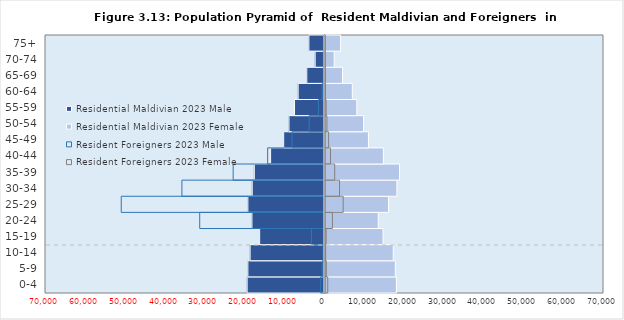
| Category | Residential Maldivian 2023 | Resident Foreigners 2023 |
|---|---|---|
|   0-4 | 17916.791 | 688.568 |
|   5-9 | 17637.264 | 325.697 |
|  10-14 | 17124.055 | 163.964 |
|  15-19 | 14566.018 | 282.09 |
|  20-24 | 13366.183 | 1859.245 |
|  25-29 | 15933.728 | 4562.052 |
|  30-34 | 18041.6 | 3649.625 |
|  35-39 | 18703.009 | 2430.982 |
|  40-44 | 14646.691 | 1377.053 |
|  45-49 | 10895.055 | 902.624 |
|  50-54 | 9681.636 | 487.225 |
|  55-59 | 7989.791 | 275.269 |
|  60-64 | 6853.791 | 120.193 |
|  65-69 | 4391 | 43.702 |
|  70-74 | 2316.264 | 13.103 |
|  75+ | 3911.264 | 6.562 |